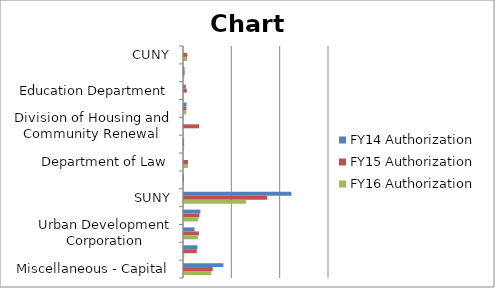
| Category | FY14 Authorization | FY15 Authorization | FY16 Authorization |
|---|---|---|---|
| CUNY | 0 | 67000000 | 67000000 |
| Division of Criminal Justice Services | 10239000 | 13750000 | 7634000 |
| Education Department | 37318000 | 57598000 | 0 |
| Department of Environmental Conservation | 50401000 | 48988000 | 46741000 |
| Division of Housing and Community Renewal | 0 | 312366643 | 0 |
| Department of Labor | 2437000 | 1804000 | 865000 |
| Department of Law | 0 | 81500234 | 81500234 |
| Office of Parks, Recreation and Historic Preservation | 58900 | 58900 | 58900 |
| SUNY | 2220813000 | 1720176000 | 1280109000 |
| Department of Transportation | 339897000 | 319118000 | 292356000 |
| Urban Development Corporation | 219715000 | 307141000 | 287808000 |
| Miscellaneous - Aid to Localities | 279034000 | 264662000 | 6280000 |
| Miscellaneous - Capital | 814039000 | 594798000 | 566802000 |